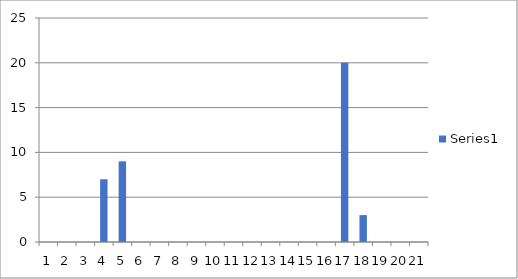
| Category | Series 0 |
|---|---|
| 0 | 0 |
| 1 | 0 |
| 2 | 0 |
| 3 | 7 |
| 4 | 9 |
| 5 | 0 |
| 6 | 0 |
| 7 | 0 |
| 8 | 0 |
| 9 | 0 |
| 10 | 0 |
| 11 | 0 |
| 12 | 0 |
| 13 | 0 |
| 14 | 0 |
| 15 | 0 |
| 16 | 20 |
| 17 | 3 |
| 18 | 0 |
| 19 | 0 |
| 20 | 0 |